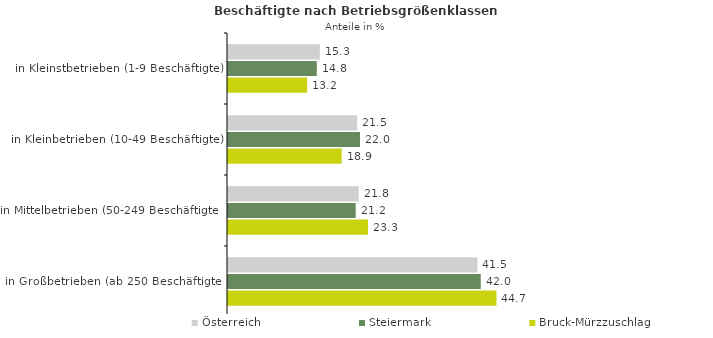
| Category | Österreich | Steiermark | Bruck-Mürzzuschlag |
|---|---|---|---|
| in Kleinstbetrieben (1-9 Beschäftigte) | 15.273 | 14.768 | 13.162 |
| in Kleinbetrieben (10-49 Beschäftigte) | 21.487 | 21.955 | 18.9 |
| in Mittelbetrieben (50-249 Beschäftigte) | 21.75 | 21.237 | 23.286 |
| in Großbetrieben (ab 250 Beschäftigte) | 41.489 | 42.04 | 44.652 |